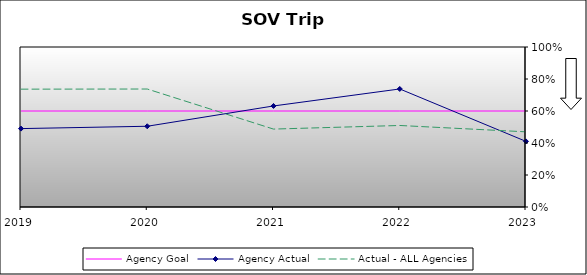
| Category | Agency Goal | Agency Actual | Actual - ALL Agencies |
|---|---|---|---|
| 2019.0 | 0.6 | 0.49 | 0.736 |
| 2020.0 | 0.6 | 0.505 | 0.737 |
| 2021.0 | 0.6 | 0.632 | 0.487 |
| 2022.0 | 0.6 | 0.738 | 0.509 |
| 2023.0 | 0.6 | 0.41 | 0.47 |